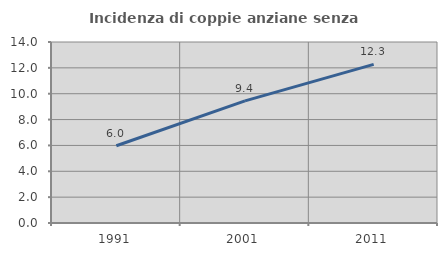
| Category | Incidenza di coppie anziane senza figli  |
|---|---|
| 1991.0 | 5.973 |
| 2001.0 | 9.443 |
| 2011.0 | 12.267 |